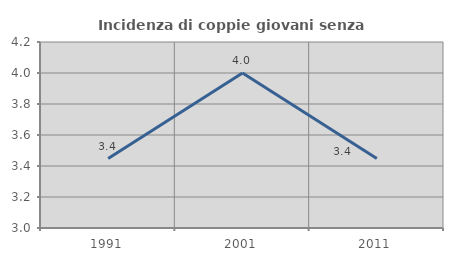
| Category | Incidenza di coppie giovani senza figli |
|---|---|
| 1991.0 | 3.448 |
| 2001.0 | 4 |
| 2011.0 | 3.448 |